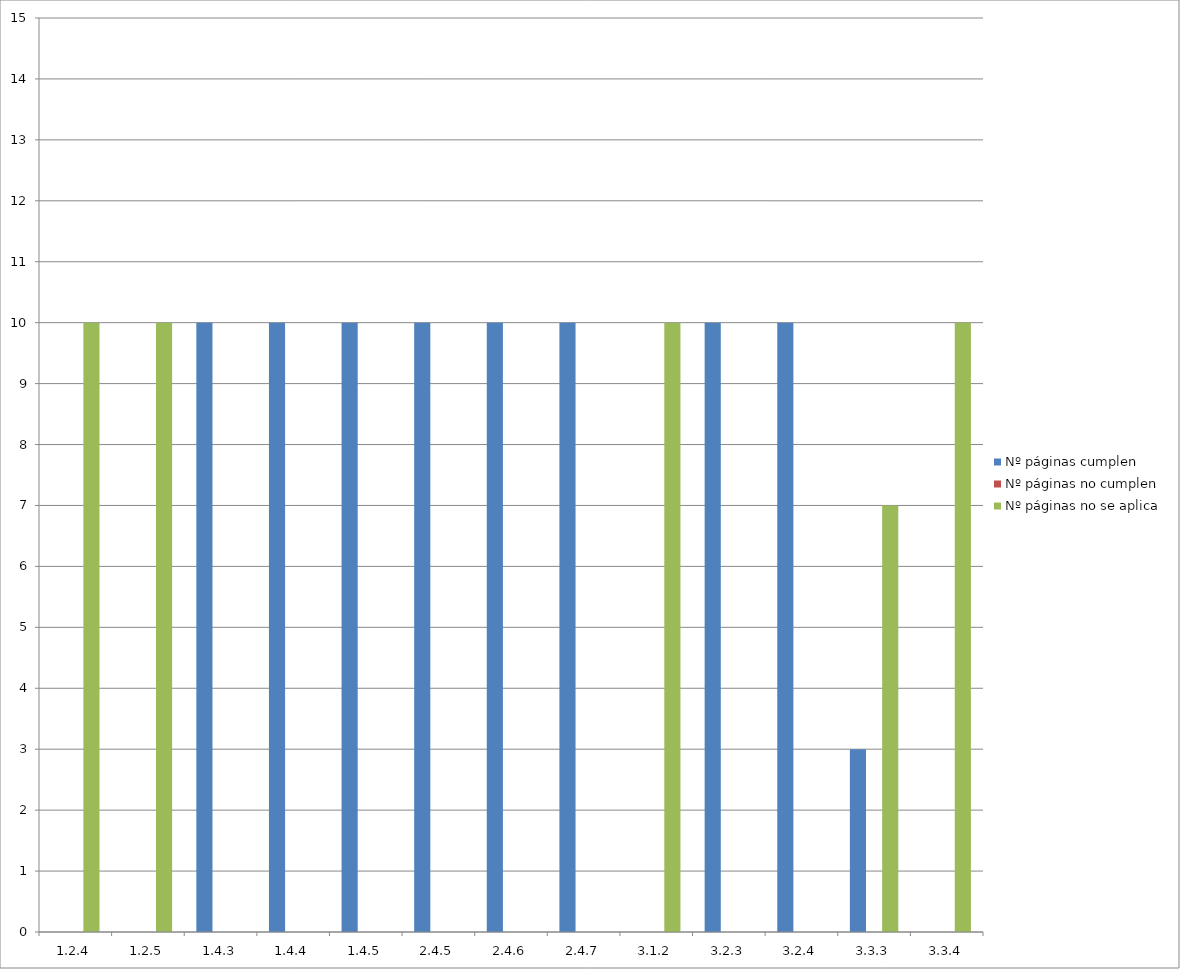
| Category | Nº páginas cumplen | Nº páginas no cumplen | Nº páginas no se aplica |
|---|---|---|---|
| 1.2.4 | 0 | 0 | 10 |
| 1.2.5 | 0 | 0 | 10 |
| 1.4.3 | 10 | 0 | 0 |
| 1.4.4 | 10 | 0 | 0 |
| 1.4.5 | 10 | 0 | 0 |
| 2.4.5 | 10 | 0 | 0 |
| 2.4.6 | 10 | 0 | 0 |
| 2.4.7 | 10 | 0 | 0 |
| 3.1.2 | 0 | 0 | 10 |
| 3.2.3 | 10 | 0 | 0 |
| 3.2.4 | 10 | 0 | 0 |
| 3.3.3 | 3 | 0 | 7 |
| 3.3.4 | 0 | 0 | 10 |